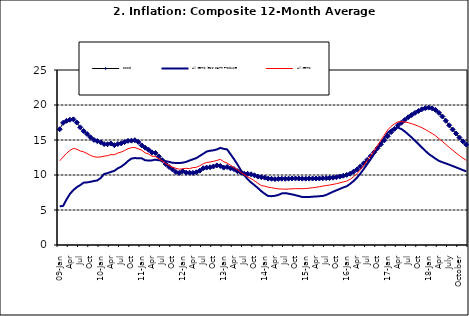
| Category | Food | All Items less Farm Produce | All Items |
|---|---|---|---|
| 09-Jan | 16.536 | 5.519 | 12.032 |
| Feb | 17.454 | 5.591 | 12.567 |
| Mar | 17.742 | 6.51 | 13.101 |
| Apr | 17.89 | 7.302 | 13.51 |
| May | 17.949 | 7.847 | 13.787 |
| June | 17.498 | 8.259 | 13.694 |
| Jul | 16.808 | 8.554 | 13.437 |
| Aug | 16.278 | 8.906 | 13.307 |
| Sep | 15.859 | 8.942 | 13.065 |
| Oct | 15.396 | 9.024 | 12.803 |
| Nov | 15.018 | 9.143 | 12.609 |
| Dec | 14.841 | 9.226 | 12.538 |
| 10-Jan | 14.668 | 9.567 | 12.586 |
| Feb | 14.411 | 10.138 | 12.7 |
| Mar | 14.395 | 10.269 | 12.757 |
| Apr | 14.489 | 10.444 | 12.915 |
| May | 14.266 | 10.597 | 12.893 |
| Jun | 14.424 | 10.948 | 13.132 |
| Jul | 14.514 | 11.193 | 13.284 |
| Aug | 14.706 | 11.549 | 13.5 |
| Sep | 14.872 | 11.997 | 13.764 |
| Oct | 14.906 | 12.345 | 13.908 |
| Nov | 14.967 | 12.423 | 13.928 |
| Dec | 14.723 | 12.383 | 13.74 |
| 11-Jan | 14.233 | 12.385 | 13.542 |
| Feb | 13.903 | 12.099 | 13.161 |
| Mar | 13.606 | 12.077 | 13.001 |
| Apr | 13.227 | 12.088 | 12.694 |
| May | 13.152 | 12.198 | 12.648 |
| Jun | 12.654 | 12.1 | 12.321 |
| Jul | 12.118 | 12.109 | 12.009 |
| Aug | 11.575 | 11.98 | 11.635 |
| Sep | 11.155 | 11.877 | 11.363 |
| Oct | 10.797 | 11.746 | 11.13 |
| Nov | 10.422 | 11.721 | 10.952 |
| Dec | 10.298 | 11.706 | 10.826 |
| 12-Jan | 10.538 | 11.765 | 10.886 |
| 12-Feb | 10.336 | 11.872 | 10.955 |
| 12-Mar | 10.325 | 12.075 | 10.914 |
| Apr | 10.304 | 12.242 | 11.054 |
| May | 10.387 | 12.419 | 11.096 |
| Jun | 10.617 | 12.732 | 11.32 |
| Jul | 10.963 | 13.032 | 11.599 |
| Aug | 11.056 | 13.349 | 11.791 |
| Sep | 11.104 | 13.467 | 11.859 |
| Oct | 11.216 | 13.525 | 11.948 |
| Nov | 11.372 | 13.649 | 12.091 |
| Dec | 11.296 | 13.873 | 12.224 |
| 13-Jan | 11.055 | 13.737 | 11.908 |
| Feb | 11.153 | 13.657 | 11.703 |
| Mar | 10.951 | 12.963 | 11.394 |
| Apr | 10.844 | 12.281 | 11.072 |
| May | 10.548 | 11.531 | 10.761 |
| Jun | 10.352 | 10.704 | 10.383 |
| Jul | 10.186 | 10.005 | 10.047 |
| Aug | 10.168 | 9.4 | 9.761 |
| Sep | 10.105 | 8.939 | 9.486 |
| Oct | 9.955 | 8.553 | 9.167 |
| Nov | 9.774 | 8.136 | 8.815 |
| Dec | 9.695 | 7.691 | 8.496 |
| 14-Jan | 9.626 | 7.317 | 8.408 |
| Feb | 9.484 | 7.005 | 8.257 |
| Mar | 9.464 | 6.976 | 8.19 |
| Apr | 9.416 | 7.03 | 8.092 |
| May | 9.448 | 7.151 | 8.012 |
| Jun | 9.464 | 7.369 | 7.998 |
| Jul | 9.459 | 7.411 | 7.968 |
| Aug | 9.481 | 7.325 | 7.996 |
| Sep | 9.501 | 7.228 | 8.027 |
| Oct | 9.508 | 7.116 | 8.047 |
| Nov | 9.492 | 6.991 | 8.046 |
| Dec | 9.481 | 6.854 | 8.047 |
| 15-Jan | 9.475 | 6.865 | 8.063 |
| Feb | 9.486 | 6.852 | 8.117 |
| Mar | 9.495 | 6.905 | 8.176 |
| Apr | 9.501 | 6.922 | 8.243 |
| May | 9.51 | 6.975 | 8.331 |
| Jun | 9.535 | 7.006 | 8.417 |
| Jul | 9.552 | 7.154 | 8.497 |
| Aug | 9.571 | 7.384 | 8.566 |
| Sep | 9.614 | 7.605 | 8.658 |
| Oct | 9.68 | 7.812 | 8.76 |
| Nov | 9.778 | 8.016 | 8.879 |
| Dec | 9.898 | 8.222 | 9.009 |
| 16-Jan | 10.017 | 8.391 | 9.13 |
| Feb | 10.184 | 8.732 | 9.386 |
| Mar | 10.471 | 9.132 | 9.751 |
| Apr | 10.786 | 9.614 | 10.182 |
| May | 11.221 | 10.196 | 10.746 |
| Jun | 11.672 | 10.864 | 11.372 |
| Jul | 12.162 | 11.553 | 12.045 |
| Aug | 12.696 | 12.247 | 12.744 |
| Sep | 13.238 | 12.98 | 13.454 |
| Oct | 13.817 | 13.757 | 14.206 |
| Nov | 14.386 | 14.542 | 14.958 |
| Dec | 14.946 | 15.307 | 15.697 |
| 17-Jan | 15.536 | 16.042 | 16.441 |
| Feb | 16.127 | 16.436 | 16.958 |
| Mar | 16.598 | 16.682 | 17.315 |
| Apr | 17.106 | 16.772 | 17.591 |
| May | 17.477 | 16.567 | 17.628 |
| Jun | 17.868 | 16.219 | 17.578 |
| Jul | 18.247 | 15.798 | 17.475 |
| Aug | 18.569 | 15.372 | 17.331 |
| Sep | 18.876 | 14.903 | 17.17 |
| Oct | 19.14 | 14.415 | 16.968 |
| Nov | 19.392 | 13.93 | 16.76 |
| Dec | 19.546 | 13.458 | 16.502 |
| 18-Jan | 19.621 | 13.01 | 16.215 |
| Feb | 19.521 | 12.668 | 15.93 |
| Mar | 19.294 | 12.33 | 15.599 |
| Apr | 18.886 | 12.021 | 15.196 |
| May | 18.359 | 11.828 | 14.793 |
| June | 17.745 | 11.651 | 14.371 |
| July | 17.102 | 11.478 | 13.95 |
| August | 16.501 | 11.285 | 13.546 |
| September | 15.923 | 11.092 | 13.157 |
| October | 15.355 | 10.903 | 12.777 |
| November | 14.802 | 10.703 | 12.406 |
| December | 14.348 | 10.514 | 12.095 |